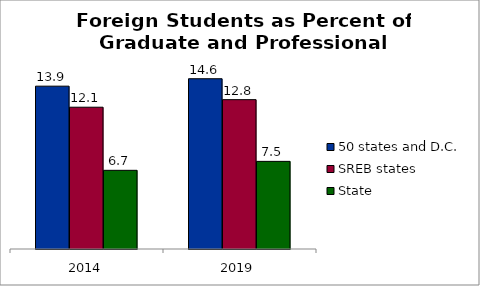
| Category | 50 states and D.C. | SREB states | State |
|---|---|---|---|
| 2014.0 | 13.932 | 12.131 | 6.732 |
| 2019.0 | 14.569 | 12.779 | 7.498 |